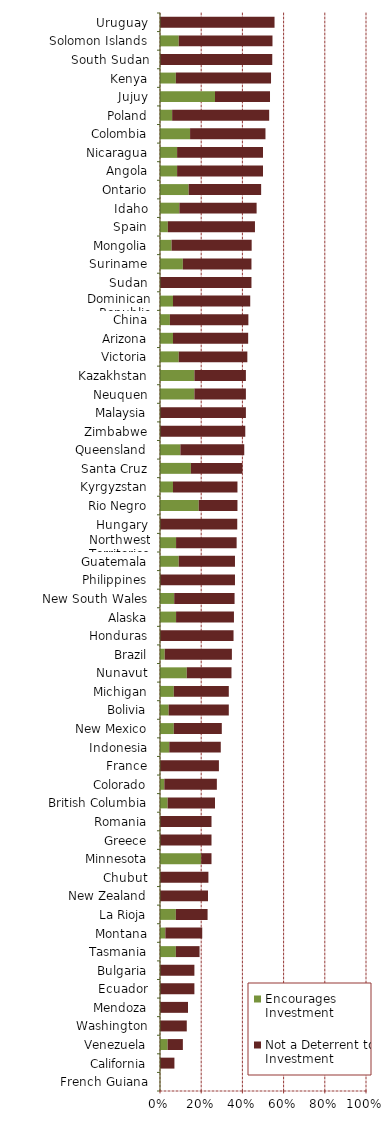
| Category | Encourages Investment | Not a Deterrent to Investment |
|---|---|---|
| French Guiana | 0 | 0 |
| California | 0 | 0.07 |
| Venezuela | 0.037 | 0.074 |
| Washington | 0 | 0.13 |
| Mendoza | 0 | 0.136 |
| Ecuador | 0 | 0.167 |
| Bulgaria | 0 | 0.167 |
| Tasmania | 0.077 | 0.115 |
| Montana | 0.026 | 0.179 |
| La Rioja | 0.077 | 0.154 |
| New Zealand | 0 | 0.233 |
| Chubut | 0 | 0.235 |
| Minnesota | 0.2 | 0.05 |
| Greece | 0 | 0.25 |
| Romania | 0 | 0.25 |
| British Columbia | 0.037 | 0.23 |
| Colorado | 0.021 | 0.255 |
| France | 0 | 0.286 |
| Indonesia | 0.045 | 0.25 |
| New Mexico | 0.067 | 0.233 |
| Bolivia | 0.042 | 0.292 |
| Michigan | 0.067 | 0.267 |
| Nunavut | 0.13 | 0.217 |
| Brazil | 0.023 | 0.326 |
| Honduras | 0 | 0.357 |
| Alaska | 0.078 | 0.281 |
| New South Wales | 0.069 | 0.293 |
| Philippines | 0 | 0.364 |
| Guatemala | 0.091 | 0.273 |
| Northwest Territories | 0.078 | 0.294 |
| Hungary | 0 | 0.375 |
| Rio Negro | 0.188 | 0.188 |
| Kyrgyzstan | 0.063 | 0.313 |
| Santa Cruz | 0.15 | 0.25 |
| Queensland | 0.099 | 0.31 |
| Zimbabwe | 0 | 0.414 |
| Malaysia | 0 | 0.417 |
| Neuquen | 0.167 | 0.25 |
| Kazakhstan | 0.167 | 0.25 |
| Victoria | 0.091 | 0.333 |
| Arizona | 0.063 | 0.365 |
| China | 0.048 | 0.381 |
| Dominican Republic | 0.063 | 0.375 |
| Sudan | 0 | 0.444 |
| Suriname | 0.111 | 0.333 |
| Mongolia | 0.056 | 0.389 |
| Spain | 0.038 | 0.423 |
| Idaho | 0.094 | 0.375 |
| Ontario | 0.139 | 0.352 |
| Angola | 0.083 | 0.417 |
| Nicaragua | 0.083 | 0.417 |
| Colombia | 0.146 | 0.366 |
| Poland | 0.059 | 0.471 |
| Jujuy | 0.267 | 0.267 |
| Kenya | 0.077 | 0.462 |
| South Sudan | 0 | 0.545 |
| Solomon Islands | 0.091 | 0.455 |
| Uruguay | 0 | 0.556 |